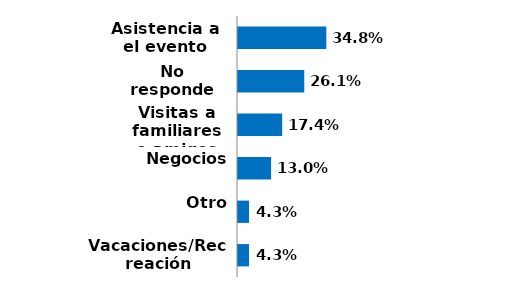
| Category | Series 0 |
|---|---|
| Vacaciones/Recreación | 0.043 |
| Otro | 0.043 |
| Negocios | 0.13 |
| Visitas a familiares o amigos | 0.174 |
| No responde | 0.261 |
| Asistencia a el evento | 0.348 |